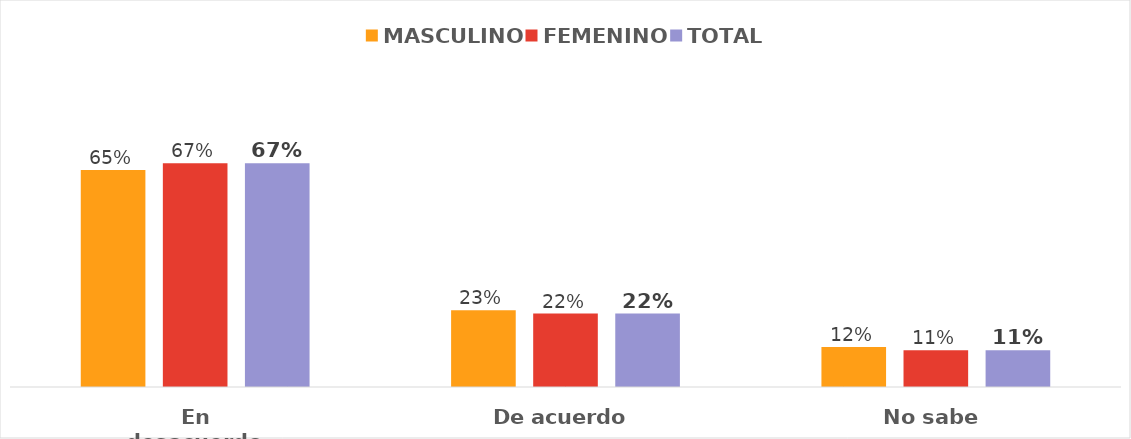
| Category | MASCULINO | FEMENINO | TOTAL |
|---|---|---|---|
| En desacuerdo | 0.65 | 0.67 | 0.67 |
| De acuerdo | 0.23 | 0.22 | 0.22 |
| No sabe | 0.12 | 0.11 | 0.11 |